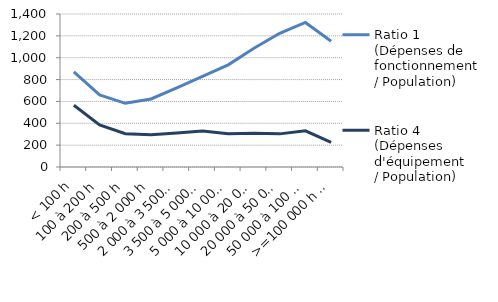
| Category | Ratio 1 
(Dépenses de fonctionnement 
/ Population) | Ratio 4 
(Dépenses d'équipement 
/ Population) |
|---|---|---|
| < 100 h | 870.568 | 564.654 |
| 100 à 200 h | 659.209 | 385.326 |
| 200 à 500 h | 582.809 | 304.286 |
| 500 à 2 000 h | 622.488 | 296.17 |
| 2 000 à 3 500 h | 724.772 | 311.042 |
| 3 500 à 5 000 h | 829.37 | 329.728 |
| 5 000 à 10 000 h | 934.539 | 305.306 |
| 10 000 à 20 000 h | 1086.581 | 309.535 |
| 20 000 à 50 000 h | 1223.354 | 303.162 |
| 50 000 à 100 000 h | 1322.52 | 331.552 |
| >=100 000 h hors Paris | 1150.676 | 225.682 |